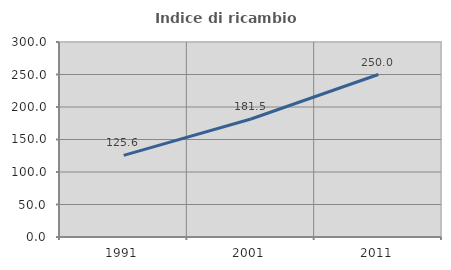
| Category | Indice di ricambio occupazionale  |
|---|---|
| 1991.0 | 125.641 |
| 2001.0 | 181.481 |
| 2011.0 | 250 |